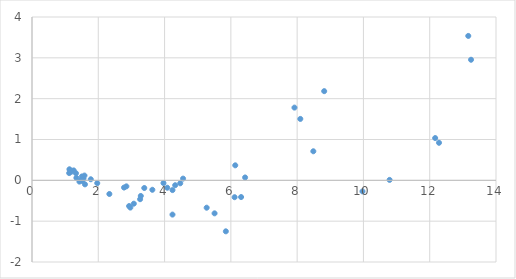
| Category | Series 0 |
|---|---|
| 4.238827837095315 | -0.239 |
| 6.4297545629946145 | 0.07 |
| 1.9685018292231582 | -0.069 |
| 1.1223526945326772 | 0.178 |
| 13.24685645766513 | 2.953 |
| 4.558004016522308 | 0.042 |
| 3.6314114417189196 | -0.231 |
| 12.164677874087833 | 1.035 |
| 4.31987037149977 | -0.12 |
| 2.334319280561427 | -0.334 |
| 1.1583440765692032 | 0.242 |
| 3.2618762479046386 | -0.462 |
| 3.2825331907076474 | -0.383 |
| 1.5983118299464212 | -0.098 |
| 3.0720044891744327 | -0.572 |
| 1.7737755666708637 | 0.026 |
| 1.2574159834694298 | 0.243 |
| 1.583248354499441 | 0.117 |
| 1.5148077740991464 | -0.015 |
| 12.280416081524455 | 0.92 |
| 8.488418965617523 | 0.712 |
| 5.848839575544621 | -1.249 |
| 2.967172495055256 | -0.667 |
| 6.113096190847869 | -0.413 |
| 1.1879664209039629 | 0.212 |
| 3.3877968094344926 | -0.188 |
| 6.309129738504159 | -0.409 |
| 4.238827837095315 | -0.839 |
| 1.5535459680373738 | 0.046 |
| 5.50838231342351 | -0.808 |
| 10.789699374469494 | 0.01 |
| 8.81610352548942 | 2.184 |
| 4.4724939975731965 | -0.072 |
| 2.776869781779602 | -0.177 |
| 1.431141955734342 | -0.031 |
| 5.270266239261153 | -0.67 |
| 1.3267312697402112 | 0.173 |
| 13.163494145612875 | 3.537 |
| 1.4863893609082104 | 0.014 |
| 2.8478826997135327 | -0.148 |
| 8.095887491113626 | 1.504 |
| 3.9669661776023495 | -0.067 |
| 1.339354168636444 | 0.061 |
| 2.9299452368327916 | -0.63 |
| 4.081275418370265 | -0.181 |
| 1.5052751065740464 | 0.095 |
| 9.97100130077639 | -0.271 |
| 6.132422274198142 | 0.368 |
| 1.1294603754051993 | 0.271 |
| 7.918970116823285 | 1.781 |